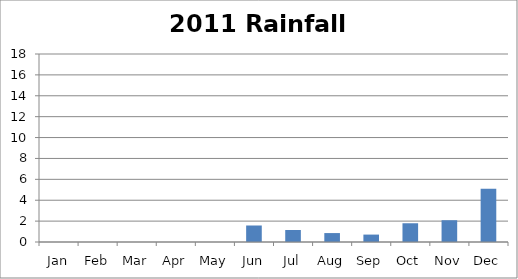
| Category | Rainfall (inches) |
|---|---|
| Jan | 0 |
| Feb | 0 |
| Mar | 0 |
| Apr | 0 |
| May | 0 |
| Jun | 1.58 |
| Jul | 1.15 |
| Aug | 0.855 |
| Sep | 0.71 |
| Oct | 1.795 |
| Nov | 2.085 |
| Dec | 5.11 |